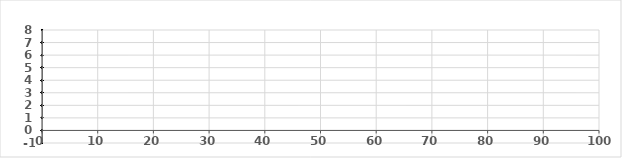
| Category | Series 0 |
|---|---|
| 0.0 | 0 |
| 1.0 | 0 |
| 2.0 | 0 |
| 3.0 | -1 |
| 4.0 | 0 |
| 5.0 | 0 |
| 6.0 | 1 |
| 7.0 | 1 |
| 8.0 | 2 |
| 9.0 | 3 |
| 10.0 | 3 |
| 11.0 | 3 |
| 12.0 | 3 |
| 13.0 | 2 |
| 14.0 | 3 |
| 15.0 | 3 |
| 16.0 | 3 |
| 17.0 | 2 |
| 18.0 | 3 |
| 19.0 | 3 |
| 20.0 | 3 |
| 21.0 | 3 |
| 22.0 | 3 |
| 23.0 | 3 |
| 24.0 | 4 |
| 25.0 | 3 |
| 26.0 | 4 |
| 27.0 | 4 |
| 28.0 | 4 |
| 29.0 | 3 |
| 30.0 | 3 |
| 31.0 | 3 |
| 32.0 | 3 |
| 33.0 | 2 |
| 34.0 | 2 |
| 35.0 | 2 |
| 36.0 | 2 |
| 37.0 | 2 |
| 38.0 | 2 |
| 39.0 | 2 |
| 40.0 | 2 |
| 41.0 | 1 |
| 42.0 | 2 |
| 43.0 | 2 |
| 44.0 | 2 |
| 45.0 | 1 |
| 46.0 | 2 |
| 47.0 | 2 |
| 48.0 | 2 |
| 49.0 | 2 |
| 50.0 | 2 |
| 51.0 | 2 |
| 52.0 | 3 |
| 53.0 | 3 |
| 54.0 | 3 |
| 55.0 | 3 |
| 56.0 | 4 |
| 57.0 | 4 |
| 58.0 | 5 |
| 59.0 | 4 |
| 60.0 | 5 |
| 61.0 | 4 |
| 62.0 | 5 |
| 63.0 | 4 |
| 64.0 | 4 |
| 65.0 | 3 |
| 66.0 | 3 |
| 67.0 | 3 |
| 68.0 | 4 |
| 69.0 | 4 |
| 70.0 | 4 |
| 71.0 | 3 |
| 72.0 | 4 |
| 73.0 | 4 |
| 74.0 | 4 |
| 75.0 | 3 |
| 76.0 | 4 |
| 77.0 | 5 |
| 78.0 | 5 |
| 79.0 | 5 |
| 80.0 | 5 |
| 81.0 | 5 |
| 82.0 | 5 |
| 83.0 | 5 |
| 84.0 | 5 |
| 85.0 | 5 |
| 86.0 | 5 |
| 87.0 | 5 |
| 88.0 | 6 |
| 89.0 | 6 |
| 90.0 | 6 |
| 91.0 | 6 |
| 92.0 | 7 |
| 93.0 | 6 |
| 94.0 | 7 |
| 95.0 | 8 |
| 96.0 | 8 |
| 97.0 | 7 |
| 98.0 | 7 |
| 99.0 | 7 |
| 100.0 | 7 |